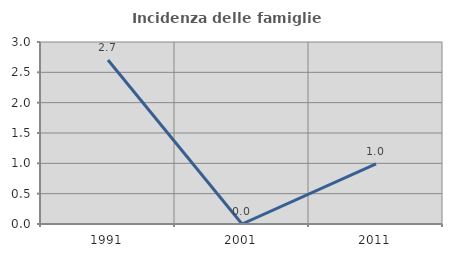
| Category | Incidenza delle famiglie numerose |
|---|---|
| 1991.0 | 2.703 |
| 2001.0 | 0 |
| 2011.0 | 0.99 |